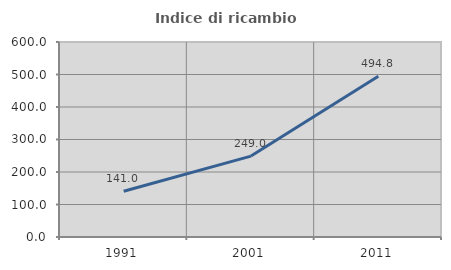
| Category | Indice di ricambio occupazionale  |
|---|---|
| 1991.0 | 140.959 |
| 2001.0 | 248.955 |
| 2011.0 | 494.805 |